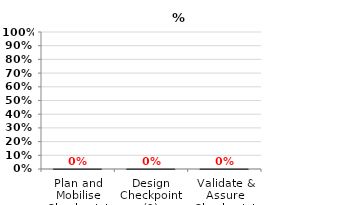
| Category | Percentage Complete |
|---|---|
| Plan and Mobilise Checkpoint (1) | 0 |
| Design Checkpoint (2) | 0 |
| Validate & Assure Checkpoint (3) | 0 |